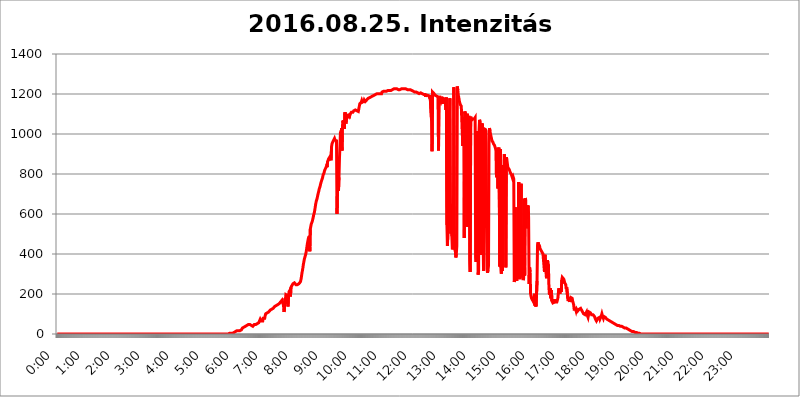
| Category | 2016.08.25. Intenzitás [W/m^2] |
|---|---|
| 0.0 | 0 |
| 0.0006944444444444445 | 0 |
| 0.001388888888888889 | 0 |
| 0.0020833333333333333 | 0 |
| 0.002777777777777778 | 0 |
| 0.003472222222222222 | 0 |
| 0.004166666666666667 | 0 |
| 0.004861111111111111 | 0 |
| 0.005555555555555556 | 0 |
| 0.0062499999999999995 | 0 |
| 0.006944444444444444 | 0 |
| 0.007638888888888889 | 0 |
| 0.008333333333333333 | 0 |
| 0.009027777777777779 | 0 |
| 0.009722222222222222 | 0 |
| 0.010416666666666666 | 0 |
| 0.011111111111111112 | 0 |
| 0.011805555555555555 | 0 |
| 0.012499999999999999 | 0 |
| 0.013194444444444444 | 0 |
| 0.013888888888888888 | 0 |
| 0.014583333333333332 | 0 |
| 0.015277777777777777 | 0 |
| 0.015972222222222224 | 0 |
| 0.016666666666666666 | 0 |
| 0.017361111111111112 | 0 |
| 0.018055555555555557 | 0 |
| 0.01875 | 0 |
| 0.019444444444444445 | 0 |
| 0.02013888888888889 | 0 |
| 0.020833333333333332 | 0 |
| 0.02152777777777778 | 0 |
| 0.022222222222222223 | 0 |
| 0.02291666666666667 | 0 |
| 0.02361111111111111 | 0 |
| 0.024305555555555556 | 0 |
| 0.024999999999999998 | 0 |
| 0.025694444444444447 | 0 |
| 0.02638888888888889 | 0 |
| 0.027083333333333334 | 0 |
| 0.027777777777777776 | 0 |
| 0.02847222222222222 | 0 |
| 0.029166666666666664 | 0 |
| 0.029861111111111113 | 0 |
| 0.030555555555555555 | 0 |
| 0.03125 | 0 |
| 0.03194444444444445 | 0 |
| 0.03263888888888889 | 0 |
| 0.03333333333333333 | 0 |
| 0.034027777777777775 | 0 |
| 0.034722222222222224 | 0 |
| 0.035416666666666666 | 0 |
| 0.036111111111111115 | 0 |
| 0.03680555555555556 | 0 |
| 0.0375 | 0 |
| 0.03819444444444444 | 0 |
| 0.03888888888888889 | 0 |
| 0.03958333333333333 | 0 |
| 0.04027777777777778 | 0 |
| 0.04097222222222222 | 0 |
| 0.041666666666666664 | 0 |
| 0.042361111111111106 | 0 |
| 0.04305555555555556 | 0 |
| 0.043750000000000004 | 0 |
| 0.044444444444444446 | 0 |
| 0.04513888888888889 | 0 |
| 0.04583333333333334 | 0 |
| 0.04652777777777778 | 0 |
| 0.04722222222222222 | 0 |
| 0.04791666666666666 | 0 |
| 0.04861111111111111 | 0 |
| 0.049305555555555554 | 0 |
| 0.049999999999999996 | 0 |
| 0.05069444444444445 | 0 |
| 0.051388888888888894 | 0 |
| 0.052083333333333336 | 0 |
| 0.05277777777777778 | 0 |
| 0.05347222222222222 | 0 |
| 0.05416666666666667 | 0 |
| 0.05486111111111111 | 0 |
| 0.05555555555555555 | 0 |
| 0.05625 | 0 |
| 0.05694444444444444 | 0 |
| 0.057638888888888885 | 0 |
| 0.05833333333333333 | 0 |
| 0.05902777777777778 | 0 |
| 0.059722222222222225 | 0 |
| 0.06041666666666667 | 0 |
| 0.061111111111111116 | 0 |
| 0.06180555555555556 | 0 |
| 0.0625 | 0 |
| 0.06319444444444444 | 0 |
| 0.06388888888888888 | 0 |
| 0.06458333333333334 | 0 |
| 0.06527777777777778 | 0 |
| 0.06597222222222222 | 0 |
| 0.06666666666666667 | 0 |
| 0.06736111111111111 | 0 |
| 0.06805555555555555 | 0 |
| 0.06874999999999999 | 0 |
| 0.06944444444444443 | 0 |
| 0.07013888888888889 | 0 |
| 0.07083333333333333 | 0 |
| 0.07152777777777779 | 0 |
| 0.07222222222222223 | 0 |
| 0.07291666666666667 | 0 |
| 0.07361111111111111 | 0 |
| 0.07430555555555556 | 0 |
| 0.075 | 0 |
| 0.07569444444444444 | 0 |
| 0.0763888888888889 | 0 |
| 0.07708333333333334 | 0 |
| 0.07777777777777778 | 0 |
| 0.07847222222222222 | 0 |
| 0.07916666666666666 | 0 |
| 0.0798611111111111 | 0 |
| 0.08055555555555556 | 0 |
| 0.08125 | 0 |
| 0.08194444444444444 | 0 |
| 0.08263888888888889 | 0 |
| 0.08333333333333333 | 0 |
| 0.08402777777777777 | 0 |
| 0.08472222222222221 | 0 |
| 0.08541666666666665 | 0 |
| 0.08611111111111112 | 0 |
| 0.08680555555555557 | 0 |
| 0.08750000000000001 | 0 |
| 0.08819444444444445 | 0 |
| 0.08888888888888889 | 0 |
| 0.08958333333333333 | 0 |
| 0.09027777777777778 | 0 |
| 0.09097222222222222 | 0 |
| 0.09166666666666667 | 0 |
| 0.09236111111111112 | 0 |
| 0.09305555555555556 | 0 |
| 0.09375 | 0 |
| 0.09444444444444444 | 0 |
| 0.09513888888888888 | 0 |
| 0.09583333333333333 | 0 |
| 0.09652777777777777 | 0 |
| 0.09722222222222222 | 0 |
| 0.09791666666666667 | 0 |
| 0.09861111111111111 | 0 |
| 0.09930555555555555 | 0 |
| 0.09999999999999999 | 0 |
| 0.10069444444444443 | 0 |
| 0.1013888888888889 | 0 |
| 0.10208333333333335 | 0 |
| 0.10277777777777779 | 0 |
| 0.10347222222222223 | 0 |
| 0.10416666666666667 | 0 |
| 0.10486111111111111 | 0 |
| 0.10555555555555556 | 0 |
| 0.10625 | 0 |
| 0.10694444444444444 | 0 |
| 0.1076388888888889 | 0 |
| 0.10833333333333334 | 0 |
| 0.10902777777777778 | 0 |
| 0.10972222222222222 | 0 |
| 0.1111111111111111 | 0 |
| 0.11180555555555556 | 0 |
| 0.11180555555555556 | 0 |
| 0.1125 | 0 |
| 0.11319444444444444 | 0 |
| 0.11388888888888889 | 0 |
| 0.11458333333333333 | 0 |
| 0.11527777777777777 | 0 |
| 0.11597222222222221 | 0 |
| 0.11666666666666665 | 0 |
| 0.1173611111111111 | 0 |
| 0.11805555555555557 | 0 |
| 0.11944444444444445 | 0 |
| 0.12013888888888889 | 0 |
| 0.12083333333333333 | 0 |
| 0.12152777777777778 | 0 |
| 0.12222222222222223 | 0 |
| 0.12291666666666667 | 0 |
| 0.12291666666666667 | 0 |
| 0.12361111111111112 | 0 |
| 0.12430555555555556 | 0 |
| 0.125 | 0 |
| 0.12569444444444444 | 0 |
| 0.12638888888888888 | 0 |
| 0.12708333333333333 | 0 |
| 0.16875 | 0 |
| 0.12847222222222224 | 0 |
| 0.12916666666666668 | 0 |
| 0.12986111111111112 | 0 |
| 0.13055555555555556 | 0 |
| 0.13125 | 0 |
| 0.13194444444444445 | 0 |
| 0.1326388888888889 | 0 |
| 0.13333333333333333 | 0 |
| 0.13402777777777777 | 0 |
| 0.13402777777777777 | 0 |
| 0.13472222222222222 | 0 |
| 0.13541666666666666 | 0 |
| 0.1361111111111111 | 0 |
| 0.13749999999999998 | 0 |
| 0.13819444444444443 | 0 |
| 0.1388888888888889 | 0 |
| 0.13958333333333334 | 0 |
| 0.14027777777777778 | 0 |
| 0.14097222222222222 | 0 |
| 0.14166666666666666 | 0 |
| 0.1423611111111111 | 0 |
| 0.14305555555555557 | 0 |
| 0.14375000000000002 | 0 |
| 0.14444444444444446 | 0 |
| 0.1451388888888889 | 0 |
| 0.1451388888888889 | 0 |
| 0.14652777777777778 | 0 |
| 0.14722222222222223 | 0 |
| 0.14791666666666667 | 0 |
| 0.1486111111111111 | 0 |
| 0.14930555555555555 | 0 |
| 0.15 | 0 |
| 0.15069444444444444 | 0 |
| 0.15138888888888888 | 0 |
| 0.15208333333333332 | 0 |
| 0.15277777777777776 | 0 |
| 0.15347222222222223 | 0 |
| 0.15416666666666667 | 0 |
| 0.15486111111111112 | 0 |
| 0.15555555555555556 | 0 |
| 0.15625 | 0 |
| 0.15694444444444444 | 0 |
| 0.15763888888888888 | 0 |
| 0.15833333333333333 | 0 |
| 0.15902777777777777 | 0 |
| 0.15972222222222224 | 0 |
| 0.16041666666666668 | 0 |
| 0.16111111111111112 | 0 |
| 0.16180555555555556 | 0 |
| 0.1625 | 0 |
| 0.16319444444444445 | 0 |
| 0.1638888888888889 | 0 |
| 0.16458333333333333 | 0 |
| 0.16527777777777777 | 0 |
| 0.16597222222222222 | 0 |
| 0.16666666666666666 | 0 |
| 0.1673611111111111 | 0 |
| 0.16805555555555554 | 0 |
| 0.16874999999999998 | 0 |
| 0.16944444444444443 | 0 |
| 0.17013888888888887 | 0 |
| 0.1708333333333333 | 0 |
| 0.17152777777777775 | 0 |
| 0.17222222222222225 | 0 |
| 0.1729166666666667 | 0 |
| 0.17361111111111113 | 0 |
| 0.17430555555555557 | 0 |
| 0.17500000000000002 | 0 |
| 0.17569444444444446 | 0 |
| 0.1763888888888889 | 0 |
| 0.17708333333333334 | 0 |
| 0.17777777777777778 | 0 |
| 0.17847222222222223 | 0 |
| 0.17916666666666667 | 0 |
| 0.1798611111111111 | 0 |
| 0.18055555555555555 | 0 |
| 0.18125 | 0 |
| 0.18194444444444444 | 0 |
| 0.1826388888888889 | 0 |
| 0.18333333333333335 | 0 |
| 0.1840277777777778 | 0 |
| 0.18472222222222223 | 0 |
| 0.18541666666666667 | 0 |
| 0.18611111111111112 | 0 |
| 0.18680555555555556 | 0 |
| 0.1875 | 0 |
| 0.18819444444444444 | 0 |
| 0.18888888888888888 | 0 |
| 0.18958333333333333 | 0 |
| 0.19027777777777777 | 0 |
| 0.1909722222222222 | 0 |
| 0.19166666666666665 | 0 |
| 0.19236111111111112 | 0 |
| 0.19305555555555554 | 0 |
| 0.19375 | 0 |
| 0.19444444444444445 | 0 |
| 0.1951388888888889 | 0 |
| 0.19583333333333333 | 0 |
| 0.19652777777777777 | 0 |
| 0.19722222222222222 | 0 |
| 0.19791666666666666 | 0 |
| 0.1986111111111111 | 0 |
| 0.19930555555555554 | 0 |
| 0.19999999999999998 | 0 |
| 0.20069444444444443 | 0 |
| 0.20138888888888887 | 0 |
| 0.2020833333333333 | 0 |
| 0.2027777777777778 | 0 |
| 0.2034722222222222 | 0 |
| 0.2041666666666667 | 0 |
| 0.20486111111111113 | 0 |
| 0.20555555555555557 | 0 |
| 0.20625000000000002 | 0 |
| 0.20694444444444446 | 0 |
| 0.2076388888888889 | 0 |
| 0.20833333333333334 | 0 |
| 0.20902777777777778 | 0 |
| 0.20972222222222223 | 0 |
| 0.21041666666666667 | 0 |
| 0.2111111111111111 | 0 |
| 0.21180555555555555 | 0 |
| 0.2125 | 0 |
| 0.21319444444444444 | 0 |
| 0.2138888888888889 | 0 |
| 0.21458333333333335 | 0 |
| 0.2152777777777778 | 0 |
| 0.21597222222222223 | 0 |
| 0.21666666666666667 | 0 |
| 0.21736111111111112 | 0 |
| 0.21805555555555556 | 0 |
| 0.21875 | 0 |
| 0.21944444444444444 | 0 |
| 0.22013888888888888 | 0 |
| 0.22083333333333333 | 0 |
| 0.22152777777777777 | 0 |
| 0.2222222222222222 | 0 |
| 0.22291666666666665 | 0 |
| 0.2236111111111111 | 0 |
| 0.22430555555555556 | 0 |
| 0.225 | 0 |
| 0.22569444444444445 | 0 |
| 0.2263888888888889 | 0 |
| 0.22708333333333333 | 0 |
| 0.22777777777777777 | 0 |
| 0.22847222222222222 | 0 |
| 0.22916666666666666 | 0 |
| 0.2298611111111111 | 0 |
| 0.23055555555555554 | 0 |
| 0.23124999999999998 | 0 |
| 0.23194444444444443 | 0 |
| 0.23263888888888887 | 0 |
| 0.2333333333333333 | 0 |
| 0.2340277777777778 | 0 |
| 0.2347222222222222 | 0 |
| 0.2354166666666667 | 0 |
| 0.23611111111111113 | 0 |
| 0.23680555555555557 | 0 |
| 0.23750000000000002 | 0 |
| 0.23819444444444446 | 0 |
| 0.2388888888888889 | 0 |
| 0.23958333333333334 | 0 |
| 0.24027777777777778 | 0 |
| 0.24097222222222223 | 3.525 |
| 0.24166666666666667 | 3.525 |
| 0.2423611111111111 | 3.525 |
| 0.24305555555555555 | 3.525 |
| 0.24375 | 3.525 |
| 0.24444444444444446 | 3.525 |
| 0.24513888888888888 | 3.525 |
| 0.24583333333333335 | 3.525 |
| 0.2465277777777778 | 7.887 |
| 0.24722222222222223 | 7.887 |
| 0.24791666666666667 | 7.887 |
| 0.24861111111111112 | 7.887 |
| 0.24930555555555556 | 12.257 |
| 0.25 | 12.257 |
| 0.25069444444444444 | 12.257 |
| 0.2513888888888889 | 12.257 |
| 0.2520833333333333 | 16.636 |
| 0.25277777777777777 | 16.636 |
| 0.2534722222222222 | 16.636 |
| 0.25416666666666665 | 16.636 |
| 0.2548611111111111 | 16.636 |
| 0.2555555555555556 | 16.636 |
| 0.25625000000000003 | 16.636 |
| 0.2569444444444445 | 21.024 |
| 0.2576388888888889 | 21.024 |
| 0.25833333333333336 | 21.024 |
| 0.2590277777777778 | 21.024 |
| 0.25972222222222224 | 29.823 |
| 0.2604166666666667 | 29.823 |
| 0.2611111111111111 | 29.823 |
| 0.26180555555555557 | 34.234 |
| 0.2625 | 34.234 |
| 0.26319444444444445 | 38.653 |
| 0.2638888888888889 | 38.653 |
| 0.26458333333333334 | 43.079 |
| 0.2652777777777778 | 43.079 |
| 0.2659722222222222 | 43.079 |
| 0.26666666666666666 | 43.079 |
| 0.2673611111111111 | 47.511 |
| 0.26805555555555555 | 47.511 |
| 0.26875 | 47.511 |
| 0.26944444444444443 | 47.511 |
| 0.2701388888888889 | 47.511 |
| 0.2708333333333333 | 47.511 |
| 0.27152777777777776 | 43.079 |
| 0.2722222222222222 | 43.079 |
| 0.27291666666666664 | 38.653 |
| 0.2736111111111111 | 38.653 |
| 0.2743055555555555 | 38.653 |
| 0.27499999999999997 | 43.079 |
| 0.27569444444444446 | 43.079 |
| 0.27638888888888885 | 47.511 |
| 0.27708333333333335 | 47.511 |
| 0.2777777777777778 | 47.511 |
| 0.27847222222222223 | 47.511 |
| 0.2791666666666667 | 47.511 |
| 0.2798611111111111 | 47.511 |
| 0.28055555555555556 | 51.951 |
| 0.28125 | 51.951 |
| 0.28194444444444444 | 56.398 |
| 0.2826388888888889 | 56.398 |
| 0.2833333333333333 | 60.85 |
| 0.28402777777777777 | 56.398 |
| 0.2847222222222222 | 74.246 |
| 0.28541666666666665 | 74.246 |
| 0.28611111111111115 | 65.31 |
| 0.28680555555555554 | 60.85 |
| 0.28750000000000003 | 60.85 |
| 0.2881944444444445 | 65.31 |
| 0.2888888888888889 | 78.722 |
| 0.28958333333333336 | 83.205 |
| 0.2902777777777778 | 83.205 |
| 0.29097222222222224 | 78.722 |
| 0.2916666666666667 | 92.184 |
| 0.2923611111111111 | 101.184 |
| 0.29305555555555557 | 101.184 |
| 0.29375 | 105.69 |
| 0.29444444444444445 | 105.69 |
| 0.2951388888888889 | 110.201 |
| 0.29583333333333334 | 110.201 |
| 0.2965277777777778 | 110.201 |
| 0.2972222222222222 | 114.716 |
| 0.29791666666666666 | 114.716 |
| 0.2986111111111111 | 119.235 |
| 0.29930555555555555 | 119.235 |
| 0.3 | 119.235 |
| 0.30069444444444443 | 123.758 |
| 0.3013888888888889 | 123.758 |
| 0.3020833333333333 | 128.284 |
| 0.30277777777777776 | 128.284 |
| 0.3034722222222222 | 132.814 |
| 0.30416666666666664 | 132.814 |
| 0.3048611111111111 | 137.347 |
| 0.3055555555555555 | 137.347 |
| 0.30624999999999997 | 137.347 |
| 0.3069444444444444 | 141.884 |
| 0.3076388888888889 | 141.884 |
| 0.30833333333333335 | 146.423 |
| 0.3090277777777778 | 146.423 |
| 0.30972222222222223 | 150.964 |
| 0.3104166666666667 | 146.423 |
| 0.3111111111111111 | 150.964 |
| 0.31180555555555556 | 150.964 |
| 0.3125 | 155.509 |
| 0.31319444444444444 | 160.056 |
| 0.3138888888888889 | 160.056 |
| 0.3145833333333333 | 160.056 |
| 0.31527777777777777 | 169.156 |
| 0.3159722222222222 | 164.605 |
| 0.31666666666666665 | 173.709 |
| 0.31736111111111115 | 141.884 |
| 0.31805555555555554 | 110.201 |
| 0.31875000000000003 | 128.284 |
| 0.3194444444444445 | 178.264 |
| 0.3201388888888889 | 150.964 |
| 0.32083333333333336 | 196.497 |
| 0.3215277777777778 | 196.497 |
| 0.32222222222222224 | 191.937 |
| 0.3229166666666667 | 191.937 |
| 0.3236111111111111 | 137.347 |
| 0.32430555555555557 | 182.82 |
| 0.325 | 210.182 |
| 0.32569444444444445 | 210.182 |
| 0.3263888888888889 | 219.309 |
| 0.32708333333333334 | 187.378 |
| 0.3277777777777778 | 233 |
| 0.3284722222222222 | 233 |
| 0.32916666666666666 | 242.127 |
| 0.3298611111111111 | 246.689 |
| 0.33055555555555555 | 251.251 |
| 0.33125 | 255.813 |
| 0.33194444444444443 | 255.813 |
| 0.3326388888888889 | 255.813 |
| 0.3333333333333333 | 255.813 |
| 0.3340277777777778 | 251.251 |
| 0.3347222222222222 | 246.689 |
| 0.3354166666666667 | 246.689 |
| 0.3361111111111111 | 246.689 |
| 0.3368055555555556 | 246.689 |
| 0.33749999999999997 | 246.689 |
| 0.33819444444444446 | 251.251 |
| 0.33888888888888885 | 251.251 |
| 0.33958333333333335 | 251.251 |
| 0.34027777777777773 | 255.813 |
| 0.34097222222222223 | 260.373 |
| 0.3416666666666666 | 269.49 |
| 0.3423611111111111 | 283.156 |
| 0.3430555555555555 | 301.354 |
| 0.34375 | 314.98 |
| 0.3444444444444445 | 328.584 |
| 0.3451388888888889 | 346.682 |
| 0.3458333333333334 | 360.221 |
| 0.34652777777777777 | 373.729 |
| 0.34722222222222227 | 382.715 |
| 0.34791666666666665 | 378.224 |
| 0.34861111111111115 | 400.638 |
| 0.34930555555555554 | 414.035 |
| 0.35000000000000003 | 431.833 |
| 0.3506944444444444 | 449.551 |
| 0.3513888888888889 | 462.786 |
| 0.3520833333333333 | 475.972 |
| 0.3527777777777778 | 480.356 |
| 0.3534722222222222 | 489.108 |
| 0.3541666666666667 | 414.035 |
| 0.3548611111111111 | 523.88 |
| 0.35555555555555557 | 536.82 |
| 0.35625 | 549.704 |
| 0.35694444444444445 | 553.986 |
| 0.3576388888888889 | 562.53 |
| 0.35833333333333334 | 566.793 |
| 0.3590277777777778 | 583.779 |
| 0.3597222222222222 | 596.45 |
| 0.36041666666666666 | 604.864 |
| 0.3611111111111111 | 617.436 |
| 0.36180555555555555 | 634.105 |
| 0.3625 | 650.667 |
| 0.36319444444444443 | 663.019 |
| 0.3638888888888889 | 667.123 |
| 0.3645833333333333 | 679.395 |
| 0.3652777777777778 | 691.608 |
| 0.3659722222222222 | 703.762 |
| 0.3666666666666667 | 711.832 |
| 0.3673611111111111 | 723.889 |
| 0.3680555555555556 | 731.896 |
| 0.36874999999999997 | 739.877 |
| 0.36944444444444446 | 751.803 |
| 0.37013888888888885 | 755.766 |
| 0.37083333333333335 | 767.62 |
| 0.37152777777777773 | 775.492 |
| 0.37222222222222223 | 783.342 |
| 0.3729166666666666 | 795.074 |
| 0.3736111111111111 | 798.974 |
| 0.3743055555555555 | 806.757 |
| 0.375 | 818.392 |
| 0.3756944444444445 | 818.392 |
| 0.3763888888888889 | 822.26 |
| 0.3770833333333334 | 833.834 |
| 0.37777777777777777 | 841.526 |
| 0.37847222222222227 | 833.834 |
| 0.37916666666666665 | 860.676 |
| 0.37986111111111115 | 868.305 |
| 0.38055555555555554 | 875.918 |
| 0.38125000000000003 | 879.719 |
| 0.3819444444444444 | 883.516 |
| 0.3826388888888889 | 887.309 |
| 0.3833333333333333 | 883.516 |
| 0.3840277777777778 | 868.305 |
| 0.3847222222222222 | 936.33 |
| 0.3854166666666667 | 951.327 |
| 0.3861111111111111 | 955.071 |
| 0.38680555555555557 | 962.555 |
| 0.3875 | 962.555 |
| 0.38819444444444445 | 962.555 |
| 0.3888888888888889 | 977.508 |
| 0.38958333333333334 | 970.034 |
| 0.3902777777777778 | 970.034 |
| 0.3909722222222222 | 970.034 |
| 0.39166666666666666 | 966.295 |
| 0.3923611111111111 | 600.661 |
| 0.39305555555555555 | 715.858 |
| 0.39375 | 763.674 |
| 0.39444444444444443 | 715.858 |
| 0.3951388888888889 | 783.342 |
| 0.3958333333333333 | 879.719 |
| 0.3965277777777778 | 940.082 |
| 0.3972222222222222 | 1011.118 |
| 0.3979166666666667 | 966.295 |
| 0.3986111111111111 | 1029.798 |
| 0.3993055555555556 | 917.534 |
| 0.39999999999999997 | 1037.277 |
| 0.40069444444444446 | 1067.267 |
| 0.40138888888888885 | 1052.255 |
| 0.40208333333333335 | 1067.267 |
| 0.40277777777777773 | 1026.06 |
| 0.40347222222222223 | 1108.816 |
| 0.4041666666666666 | 1093.653 |
| 0.4048611111111111 | 1052.255 |
| 0.4055555555555555 | 1071.027 |
| 0.40625 | 1093.653 |
| 0.4069444444444445 | 1089.873 |
| 0.4076388888888889 | 1089.873 |
| 0.4083333333333334 | 1093.653 |
| 0.40902777777777777 | 1078.555 |
| 0.40972222222222227 | 1101.226 |
| 0.41041666666666665 | 1093.653 |
| 0.41111111111111115 | 1101.226 |
| 0.41180555555555554 | 1105.019 |
| 0.41250000000000003 | 1108.816 |
| 0.4131944444444444 | 1108.816 |
| 0.4138888888888889 | 1108.816 |
| 0.4145833333333333 | 1108.816 |
| 0.4152777777777778 | 1112.618 |
| 0.4159722222222222 | 1116.426 |
| 0.4166666666666667 | 1116.426 |
| 0.4173611111111111 | 1120.238 |
| 0.41805555555555557 | 1120.238 |
| 0.41875 | 1116.426 |
| 0.41944444444444445 | 1116.426 |
| 0.4201388888888889 | 1116.426 |
| 0.42083333333333334 | 1112.618 |
| 0.4215277777777778 | 1112.618 |
| 0.4222222222222222 | 1112.618 |
| 0.42291666666666666 | 1116.426 |
| 0.4236111111111111 | 1116.426 |
| 0.42430555555555555 | 1150.946 |
| 0.425 | 1147.086 |
| 0.42569444444444443 | 1147.086 |
| 0.4263888888888889 | 1158.689 |
| 0.4270833333333333 | 1166.46 |
| 0.4277777777777778 | 1158.689 |
| 0.4284722222222222 | 1158.689 |
| 0.4291666666666667 | 1158.689 |
| 0.4298611111111111 | 1162.571 |
| 0.4305555555555556 | 1170.358 |
| 0.43124999999999997 | 1166.46 |
| 0.43194444444444446 | 1162.571 |
| 0.43263888888888885 | 1166.46 |
| 0.43333333333333335 | 1162.571 |
| 0.43402777777777773 | 1170.358 |
| 0.43472222222222223 | 1170.358 |
| 0.4354166666666666 | 1174.263 |
| 0.4361111111111111 | 1178.177 |
| 0.4368055555555555 | 1178.177 |
| 0.4375 | 1178.177 |
| 0.4381944444444445 | 1182.099 |
| 0.4388888888888889 | 1178.177 |
| 0.4395833333333334 | 1182.099 |
| 0.44027777777777777 | 1186.03 |
| 0.44097222222222227 | 1186.03 |
| 0.44166666666666665 | 1186.03 |
| 0.44236111111111115 | 1189.969 |
| 0.44305555555555554 | 1193.918 |
| 0.44375000000000003 | 1193.918 |
| 0.4444444444444444 | 1193.918 |
| 0.4451388888888889 | 1193.918 |
| 0.4458333333333333 | 1197.876 |
| 0.4465277777777778 | 1197.876 |
| 0.4472222222222222 | 1197.876 |
| 0.4479166666666667 | 1201.843 |
| 0.4486111111111111 | 1201.843 |
| 0.44930555555555557 | 1201.843 |
| 0.45 | 1201.843 |
| 0.45069444444444445 | 1201.843 |
| 0.4513888888888889 | 1201.843 |
| 0.45208333333333334 | 1201.843 |
| 0.4527777777777778 | 1201.843 |
| 0.4534722222222222 | 1197.876 |
| 0.45416666666666666 | 1201.843 |
| 0.4548611111111111 | 1201.843 |
| 0.45555555555555555 | 1209.807 |
| 0.45625 | 1213.804 |
| 0.45694444444444443 | 1213.804 |
| 0.4576388888888889 | 1213.804 |
| 0.4583333333333333 | 1209.807 |
| 0.4590277777777778 | 1213.804 |
| 0.4597222222222222 | 1213.804 |
| 0.4604166666666667 | 1213.804 |
| 0.4611111111111111 | 1217.812 |
| 0.4618055555555556 | 1213.804 |
| 0.46249999999999997 | 1213.804 |
| 0.46319444444444446 | 1213.804 |
| 0.46388888888888885 | 1217.812 |
| 0.46458333333333335 | 1217.812 |
| 0.46527777777777773 | 1213.804 |
| 0.46597222222222223 | 1217.812 |
| 0.4666666666666666 | 1217.812 |
| 0.4673611111111111 | 1213.804 |
| 0.4680555555555555 | 1217.812 |
| 0.46875 | 1217.812 |
| 0.4694444444444445 | 1221.83 |
| 0.4701388888888889 | 1221.83 |
| 0.4708333333333334 | 1221.83 |
| 0.47152777777777777 | 1225.859 |
| 0.47222222222222227 | 1225.859 |
| 0.47291666666666665 | 1225.859 |
| 0.47361111111111115 | 1225.859 |
| 0.47430555555555554 | 1225.859 |
| 0.47500000000000003 | 1225.859 |
| 0.4756944444444444 | 1225.859 |
| 0.4763888888888889 | 1225.859 |
| 0.4770833333333333 | 1225.859 |
| 0.4777777777777778 | 1221.83 |
| 0.4784722222222222 | 1221.83 |
| 0.4791666666666667 | 1221.83 |
| 0.4798611111111111 | 1221.83 |
| 0.48055555555555557 | 1221.83 |
| 0.48125 | 1225.859 |
| 0.48194444444444445 | 1225.859 |
| 0.4826388888888889 | 1225.859 |
| 0.48333333333333334 | 1225.859 |
| 0.4840277777777778 | 1225.859 |
| 0.4847222222222222 | 1225.859 |
| 0.48541666666666666 | 1225.859 |
| 0.4861111111111111 | 1225.859 |
| 0.48680555555555555 | 1225.859 |
| 0.4875 | 1225.859 |
| 0.48819444444444443 | 1225.859 |
| 0.4888888888888889 | 1225.859 |
| 0.4895833333333333 | 1221.83 |
| 0.4902777777777778 | 1225.859 |
| 0.4909722222222222 | 1221.83 |
| 0.4916666666666667 | 1221.83 |
| 0.4923611111111111 | 1221.83 |
| 0.4930555555555556 | 1221.83 |
| 0.49374999999999997 | 1221.83 |
| 0.49444444444444446 | 1225.859 |
| 0.49513888888888885 | 1221.83 |
| 0.49583333333333335 | 1217.812 |
| 0.49652777777777773 | 1217.812 |
| 0.49722222222222223 | 1217.812 |
| 0.4979166666666666 | 1217.812 |
| 0.4986111111111111 | 1217.812 |
| 0.4993055555555555 | 1213.804 |
| 0.5 | 1213.804 |
| 0.5006944444444444 | 1209.807 |
| 0.5013888888888889 | 1209.807 |
| 0.5020833333333333 | 1209.807 |
| 0.5027777777777778 | 1209.807 |
| 0.5034722222222222 | 1209.807 |
| 0.5041666666666667 | 1205.82 |
| 0.5048611111111111 | 1205.82 |
| 0.5055555555555555 | 1205.82 |
| 0.50625 | 1205.82 |
| 0.5069444444444444 | 1205.82 |
| 0.5076388888888889 | 1201.843 |
| 0.5083333333333333 | 1205.82 |
| 0.5090277777777777 | 1201.843 |
| 0.5097222222222222 | 1205.82 |
| 0.5104166666666666 | 1201.843 |
| 0.5111111111111112 | 1201.843 |
| 0.5118055555555555 | 1201.843 |
| 0.5125000000000001 | 1201.843 |
| 0.5131944444444444 | 1197.876 |
| 0.513888888888889 | 1197.876 |
| 0.5145833333333333 | 1193.918 |
| 0.5152777777777778 | 1197.876 |
| 0.5159722222222222 | 1197.876 |
| 0.5166666666666667 | 1186.03 |
| 0.517361111111111 | 1193.918 |
| 0.5180555555555556 | 1189.969 |
| 0.5187499999999999 | 1193.918 |
| 0.5194444444444445 | 1193.918 |
| 0.5201388888888888 | 1189.969 |
| 0.5208333333333334 | 1189.969 |
| 0.5215277777777778 | 1189.969 |
| 0.5222222222222223 | 1178.177 |
| 0.5229166666666667 | 1193.918 |
| 0.5236111111111111 | 1197.876 |
| 0.5243055555555556 | 1197.876 |
| 0.525 | 1067.267 |
| 0.5256944444444445 | 913.766 |
| 0.5263888888888889 | 1209.807 |
| 0.5270833333333333 | 1205.82 |
| 0.5277777777777778 | 1205.82 |
| 0.5284722222222222 | 1201.843 |
| 0.5291666666666667 | 1197.876 |
| 0.5298611111111111 | 1193.918 |
| 0.5305555555555556 | 1189.969 |
| 0.53125 | 1189.969 |
| 0.5319444444444444 | 1189.969 |
| 0.5326388888888889 | 1186.03 |
| 0.5333333333333333 | 1186.03 |
| 0.5340277777777778 | 1186.03 |
| 0.5347222222222222 | 917.534 |
| 0.5354166666666667 | 1189.969 |
| 0.5361111111111111 | 1189.969 |
| 0.5368055555555555 | 1178.177 |
| 0.5375 | 1170.358 |
| 0.5381944444444444 | 1162.571 |
| 0.5388888888888889 | 1170.358 |
| 0.5395833333333333 | 1170.358 |
| 0.5402777777777777 | 1166.46 |
| 0.5409722222222222 | 1150.946 |
| 0.5416666666666666 | 1178.177 |
| 0.5423611111111112 | 1178.177 |
| 0.5430555555555555 | 1182.099 |
| 0.5437500000000001 | 1174.263 |
| 0.5444444444444444 | 1174.263 |
| 0.545138888888889 | 1120.238 |
| 0.5458333333333333 | 1182.099 |
| 0.5465277777777778 | 545.416 |
| 0.5472222222222222 | 440.702 |
| 0.5479166666666667 | 510.885 |
| 0.548611111111111 | 739.877 |
| 0.5493055555555556 | 936.33 |
| 0.5499999999999999 | 1093.653 |
| 0.5506944444444445 | 1178.177 |
| 0.5513888888888888 | 558.261 |
| 0.5520833333333334 | 502.192 |
| 0.5527777777777778 | 650.667 |
| 0.5534722222222223 | 489.108 |
| 0.5541666666666667 | 422.943 |
| 0.5548611111111111 | 418.492 |
| 0.5555555555555556 | 445.129 |
| 0.55625 | 1233.951 |
| 0.5569444444444445 | 445.129 |
| 0.5576388888888889 | 497.836 |
| 0.5583333333333333 | 414.035 |
| 0.5590277777777778 | 382.715 |
| 0.5597222222222222 | 400.638 |
| 0.5604166666666667 | 440.702 |
| 0.5611111111111111 | 1238.014 |
| 0.5618055555555556 | 1217.812 |
| 0.5625 | 1193.918 |
| 0.5631944444444444 | 1182.099 |
| 0.5638888888888889 | 1166.46 |
| 0.5645833333333333 | 1154.814 |
| 0.5652777777777778 | 1147.086 |
| 0.5659722222222222 | 1147.086 |
| 0.5666666666666667 | 1139.384 |
| 0.5673611111111111 | 1143.232 |
| 0.5680555555555555 | 1139.384 |
| 0.56875 | 940.082 |
| 0.5694444444444444 | 1082.324 |
| 0.5701388888888889 | 1071.027 |
| 0.5708333333333333 | 480.356 |
| 0.5715277777777777 | 1112.618 |
| 0.5722222222222222 | 1108.816 |
| 0.5729166666666666 | 1097.437 |
| 0.5736111111111112 | 1101.226 |
| 0.5743055555555555 | 1037.277 |
| 0.5750000000000001 | 1101.226 |
| 0.5756944444444444 | 536.82 |
| 0.576388888888889 | 1014.852 |
| 0.5770833333333333 | 1089.873 |
| 0.5777777777777778 | 1082.324 |
| 0.5784722222222222 | 364.728 |
| 0.5791666666666667 | 310.44 |
| 0.579861111111111 | 1086.097 |
| 0.5805555555555556 | 1067.267 |
| 0.5812499999999999 | 1071.027 |
| 0.5819444444444445 | 1071.027 |
| 0.5826388888888888 | 1074.789 |
| 0.5833333333333334 | 1071.027 |
| 0.5840277777777778 | 1074.789 |
| 0.5847222222222223 | 1074.789 |
| 0.5854166666666667 | 1071.027 |
| 0.5861111111111111 | 1082.324 |
| 0.5868055555555556 | 382.715 |
| 0.5875 | 360.221 |
| 0.5881944444444445 | 575.299 |
| 0.5888888888888889 | 1014.852 |
| 0.5895833333333333 | 909.996 |
| 0.5902777777777778 | 296.808 |
| 0.5909722222222222 | 314.98 |
| 0.5916666666666667 | 1022.323 |
| 0.5923611111111111 | 1071.027 |
| 0.5930555555555556 | 1059.756 |
| 0.59375 | 1044.762 |
| 0.5944444444444444 | 1052.255 |
| 0.5951388888888889 | 396.164 |
| 0.5958333333333333 | 1052.255 |
| 0.5965277777777778 | 1033.537 |
| 0.5972222222222222 | 467.187 |
| 0.5979166666666667 | 314.98 |
| 0.5986111111111111 | 1026.06 |
| 0.5993055555555555 | 1022.323 |
| 0.6 | 1026.06 |
| 0.6006944444444444 | 1022.323 |
| 0.6013888888888889 | 1014.852 |
| 0.6020833333333333 | 1014.852 |
| 0.6027777777777777 | 324.052 |
| 0.6034722222222222 | 305.898 |
| 0.6041666666666666 | 319.517 |
| 0.6048611111111112 | 342.162 |
| 0.6055555555555555 | 951.327 |
| 0.6062500000000001 | 1029.798 |
| 0.6069444444444444 | 1014.852 |
| 0.607638888888889 | 999.916 |
| 0.6083333333333333 | 988.714 |
| 0.6090277777777778 | 977.508 |
| 0.6097222222222222 | 966.295 |
| 0.6104166666666667 | 966.295 |
| 0.611111111111111 | 958.814 |
| 0.6118055555555556 | 951.327 |
| 0.6124999999999999 | 947.58 |
| 0.6131944444444445 | 943.832 |
| 0.6138888888888888 | 940.082 |
| 0.6145833333333334 | 928.819 |
| 0.6152777777777778 | 917.534 |
| 0.6159722222222223 | 783.342 |
| 0.6166666666666667 | 902.447 |
| 0.6173611111111111 | 837.682 |
| 0.6180555555555556 | 727.896 |
| 0.61875 | 925.06 |
| 0.6194444444444445 | 932.576 |
| 0.6201388888888889 | 928.819 |
| 0.6208333333333333 | 337.639 |
| 0.6215277777777778 | 925.06 |
| 0.6222222222222222 | 333.113 |
| 0.6229166666666667 | 301.354 |
| 0.6236111111111111 | 663.019 |
| 0.6243055555555556 | 314.98 |
| 0.625 | 319.517 |
| 0.6256944444444444 | 845.365 |
| 0.6263888888888889 | 707.8 |
| 0.6270833333333333 | 898.668 |
| 0.6277777777777778 | 894.885 |
| 0.6284722222222222 | 802.868 |
| 0.6291666666666667 | 333.113 |
| 0.6298611111111111 | 883.516 |
| 0.6305555555555555 | 872.114 |
| 0.63125 | 853.029 |
| 0.6319444444444444 | 833.834 |
| 0.6326388888888889 | 837.682 |
| 0.6333333333333333 | 829.981 |
| 0.6340277777777777 | 822.26 |
| 0.6347222222222222 | 814.519 |
| 0.6354166666666666 | 806.757 |
| 0.6361111111111112 | 802.868 |
| 0.6368055555555555 | 798.974 |
| 0.6375000000000001 | 791.169 |
| 0.6381944444444444 | 787.258 |
| 0.638888888888889 | 775.492 |
| 0.6395833333333333 | 783.342 |
| 0.6402777777777778 | 775.492 |
| 0.6409722222222222 | 260.373 |
| 0.6416666666666667 | 274.047 |
| 0.642361111111111 | 634.105 |
| 0.6430555555555556 | 292.259 |
| 0.6437499999999999 | 292.259 |
| 0.6444444444444445 | 264.932 |
| 0.6451388888888888 | 264.932 |
| 0.6458333333333334 | 480.356 |
| 0.6465277777777778 | 292.259 |
| 0.6472222222222223 | 759.723 |
| 0.6479166666666667 | 296.808 |
| 0.6486111111111111 | 274.047 |
| 0.6493055555555556 | 274.047 |
| 0.65 | 654.791 |
| 0.6506944444444445 | 751.803 |
| 0.6513888888888889 | 283.156 |
| 0.6520833333333333 | 278.603 |
| 0.6527777777777778 | 328.584 |
| 0.6534722222222222 | 269.49 |
| 0.6541666666666667 | 278.603 |
| 0.6548611111111111 | 675.311 |
| 0.6555555555555556 | 292.259 |
| 0.65625 | 679.395 |
| 0.6569444444444444 | 671.22 |
| 0.6576388888888889 | 528.2 |
| 0.6583333333333333 | 625.784 |
| 0.6590277777777778 | 642.4 |
| 0.6597222222222222 | 634.105 |
| 0.6604166666666667 | 642.4 |
| 0.6611111111111111 | 583.779 |
| 0.6618055555555555 | 251.251 |
| 0.6625 | 333.113 |
| 0.6631944444444444 | 310.44 |
| 0.6638888888888889 | 201.058 |
| 0.6645833333333333 | 187.378 |
| 0.6652777777777777 | 178.264 |
| 0.6659722222222222 | 173.709 |
| 0.6666666666666666 | 169.156 |
| 0.6673611111111111 | 164.605 |
| 0.6680555555555556 | 160.056 |
| 0.6687500000000001 | 155.509 |
| 0.6694444444444444 | 201.058 |
| 0.6701388888888888 | 141.884 |
| 0.6708333333333334 | 150.964 |
| 0.6715277777777778 | 137.347 |
| 0.6722222222222222 | 137.347 |
| 0.6729166666666666 | 264.932 |
| 0.6736111111111112 | 445.129 |
| 0.6743055555555556 | 458.38 |
| 0.6749999999999999 | 449.551 |
| 0.6756944444444444 | 449.551 |
| 0.6763888888888889 | 440.702 |
| 0.6770833333333334 | 427.39 |
| 0.6777777777777777 | 422.943 |
| 0.6784722222222223 | 418.492 |
| 0.6791666666666667 | 414.035 |
| 0.6798611111111111 | 409.574 |
| 0.6805555555555555 | 405.108 |
| 0.68125 | 400.638 |
| 0.6819444444444445 | 400.638 |
| 0.6826388888888889 | 396.164 |
| 0.6833333333333332 | 310.44 |
| 0.6840277777777778 | 396.164 |
| 0.6847222222222222 | 351.198 |
| 0.6854166666666667 | 314.98 |
| 0.686111111111111 | 278.603 |
| 0.6868055555555556 | 328.584 |
| 0.6875 | 369.23 |
| 0.6881944444444444 | 355.712 |
| 0.688888888888889 | 346.682 |
| 0.6895833333333333 | 237.564 |
| 0.6902777777777778 | 196.497 |
| 0.6909722222222222 | 191.937 |
| 0.6916666666666668 | 228.436 |
| 0.6923611111111111 | 178.264 |
| 0.6930555555555555 | 219.309 |
| 0.69375 | 164.605 |
| 0.6944444444444445 | 160.056 |
| 0.6951388888888889 | 155.509 |
| 0.6958333333333333 | 150.964 |
| 0.6965277777777777 | 150.964 |
| 0.6972222222222223 | 160.056 |
| 0.6979166666666666 | 173.709 |
| 0.6986111111111111 | 160.056 |
| 0.6993055555555556 | 155.509 |
| 0.7000000000000001 | 155.509 |
| 0.7006944444444444 | 160.056 |
| 0.7013888888888888 | 169.156 |
| 0.7020833333333334 | 178.264 |
| 0.7027777777777778 | 182.82 |
| 0.7034722222222222 | 228.436 |
| 0.7041666666666666 | 223.873 |
| 0.7048611111111112 | 201.058 |
| 0.7055555555555556 | 201.058 |
| 0.7062499999999999 | 228.436 |
| 0.7069444444444444 | 210.182 |
| 0.7076388888888889 | 269.49 |
| 0.7083333333333334 | 283.156 |
| 0.7090277777777777 | 283.156 |
| 0.7097222222222223 | 278.603 |
| 0.7104166666666667 | 274.047 |
| 0.7111111111111111 | 264.932 |
| 0.7118055555555555 | 255.813 |
| 0.7125 | 251.251 |
| 0.7131944444444445 | 246.689 |
| 0.7138888888888889 | 223.873 |
| 0.7145833333333332 | 233 |
| 0.7152777777777778 | 228.436 |
| 0.7159722222222222 | 178.264 |
| 0.7166666666666667 | 164.605 |
| 0.717361111111111 | 169.156 |
| 0.7180555555555556 | 182.82 |
| 0.71875 | 160.056 |
| 0.7194444444444444 | 173.709 |
| 0.720138888888889 | 182.82 |
| 0.7208333333333333 | 182.82 |
| 0.7215277777777778 | 182.82 |
| 0.7222222222222222 | 178.264 |
| 0.7229166666666668 | 164.605 |
| 0.7236111111111111 | 160.056 |
| 0.7243055555555555 | 146.423 |
| 0.725 | 123.758 |
| 0.7256944444444445 | 123.758 |
| 0.7263888888888889 | 123.758 |
| 0.7270833333333333 | 123.758 |
| 0.7277777777777777 | 114.716 |
| 0.7284722222222223 | 123.758 |
| 0.7291666666666666 | 123.758 |
| 0.7298611111111111 | 114.716 |
| 0.7305555555555556 | 119.235 |
| 0.7312500000000001 | 119.235 |
| 0.7319444444444444 | 123.758 |
| 0.7326388888888888 | 123.758 |
| 0.7333333333333334 | 128.284 |
| 0.7340277777777778 | 128.284 |
| 0.7347222222222222 | 123.758 |
| 0.7354166666666666 | 119.235 |
| 0.7361111111111112 | 114.716 |
| 0.7368055555555556 | 110.201 |
| 0.7374999999999999 | 105.69 |
| 0.7381944444444444 | 101.184 |
| 0.7388888888888889 | 101.184 |
| 0.7395833333333334 | 101.184 |
| 0.7402777777777777 | 96.682 |
| 0.7409722222222223 | 96.682 |
| 0.7416666666666667 | 96.682 |
| 0.7423611111111111 | 110.201 |
| 0.7430555555555555 | 96.682 |
| 0.74375 | 92.184 |
| 0.7444444444444445 | 83.205 |
| 0.7451388888888889 | 96.682 |
| 0.7458333333333332 | 110.201 |
| 0.7465277777777778 | 110.201 |
| 0.7472222222222222 | 110.201 |
| 0.7479166666666667 | 105.69 |
| 0.748611111111111 | 101.184 |
| 0.7493055555555556 | 96.682 |
| 0.75 | 92.184 |
| 0.7506944444444444 | 92.184 |
| 0.751388888888889 | 96.682 |
| 0.7520833333333333 | 101.184 |
| 0.7527777777777778 | 92.184 |
| 0.7534722222222222 | 87.692 |
| 0.7541666666666668 | 83.205 |
| 0.7548611111111111 | 74.246 |
| 0.7555555555555555 | 74.246 |
| 0.75625 | 65.31 |
| 0.7569444444444445 | 69.775 |
| 0.7576388888888889 | 69.775 |
| 0.7583333333333333 | 78.722 |
| 0.7590277777777777 | 83.205 |
| 0.7597222222222223 | 83.205 |
| 0.7604166666666666 | 83.205 |
| 0.7611111111111111 | 74.246 |
| 0.7618055555555556 | 74.246 |
| 0.7625000000000001 | 78.722 |
| 0.7631944444444444 | 92.184 |
| 0.7638888888888888 | 101.184 |
| 0.7645833333333334 | 92.184 |
| 0.7652777777777778 | 87.692 |
| 0.7659722222222222 | 78.722 |
| 0.7666666666666666 | 87.692 |
| 0.7673611111111112 | 87.692 |
| 0.7680555555555556 | 87.692 |
| 0.7687499999999999 | 83.205 |
| 0.7694444444444444 | 78.722 |
| 0.7701388888888889 | 78.722 |
| 0.7708333333333334 | 74.246 |
| 0.7715277777777777 | 74.246 |
| 0.7722222222222223 | 74.246 |
| 0.7729166666666667 | 69.775 |
| 0.7736111111111111 | 69.775 |
| 0.7743055555555555 | 65.31 |
| 0.775 | 65.31 |
| 0.7756944444444445 | 60.85 |
| 0.7763888888888889 | 60.85 |
| 0.7770833333333332 | 60.85 |
| 0.7777777777777778 | 56.398 |
| 0.7784722222222222 | 56.398 |
| 0.7791666666666667 | 56.398 |
| 0.779861111111111 | 51.951 |
| 0.7805555555555556 | 51.951 |
| 0.78125 | 51.951 |
| 0.7819444444444444 | 47.511 |
| 0.782638888888889 | 47.511 |
| 0.7833333333333333 | 47.511 |
| 0.7840277777777778 | 47.511 |
| 0.7847222222222222 | 47.511 |
| 0.7854166666666668 | 43.079 |
| 0.7861111111111111 | 43.079 |
| 0.7868055555555555 | 43.079 |
| 0.7875 | 43.079 |
| 0.7881944444444445 | 43.079 |
| 0.7888888888888889 | 38.653 |
| 0.7895833333333333 | 38.653 |
| 0.7902777777777777 | 38.653 |
| 0.7909722222222223 | 38.653 |
| 0.7916666666666666 | 38.653 |
| 0.7923611111111111 | 38.653 |
| 0.7930555555555556 | 34.234 |
| 0.7937500000000001 | 34.234 |
| 0.7944444444444444 | 34.234 |
| 0.7951388888888888 | 34.234 |
| 0.7958333333333334 | 29.823 |
| 0.7965277777777778 | 29.823 |
| 0.7972222222222222 | 29.823 |
| 0.7979166666666666 | 29.823 |
| 0.7986111111111112 | 25.419 |
| 0.7993055555555556 | 25.419 |
| 0.7999999999999999 | 25.419 |
| 0.8006944444444444 | 25.419 |
| 0.8013888888888889 | 21.024 |
| 0.8020833333333334 | 21.024 |
| 0.8027777777777777 | 21.024 |
| 0.8034722222222223 | 16.636 |
| 0.8041666666666667 | 16.636 |
| 0.8048611111111111 | 16.636 |
| 0.8055555555555555 | 16.636 |
| 0.80625 | 12.257 |
| 0.8069444444444445 | 12.257 |
| 0.8076388888888889 | 12.257 |
| 0.8083333333333332 | 12.257 |
| 0.8090277777777778 | 12.257 |
| 0.8097222222222222 | 7.887 |
| 0.8104166666666667 | 7.887 |
| 0.811111111111111 | 7.887 |
| 0.8118055555555556 | 7.887 |
| 0.8125 | 7.887 |
| 0.8131944444444444 | 3.525 |
| 0.813888888888889 | 3.525 |
| 0.8145833333333333 | 3.525 |
| 0.8152777777777778 | 3.525 |
| 0.8159722222222222 | 3.525 |
| 0.8166666666666668 | 3.525 |
| 0.8173611111111111 | 3.525 |
| 0.8180555555555555 | 0 |
| 0.81875 | 0 |
| 0.8194444444444445 | 0 |
| 0.8201388888888889 | 0 |
| 0.8208333333333333 | 0 |
| 0.8215277777777777 | 0 |
| 0.8222222222222223 | 0 |
| 0.8229166666666666 | 0 |
| 0.8236111111111111 | 0 |
| 0.8243055555555556 | 0 |
| 0.8250000000000001 | 0 |
| 0.8256944444444444 | 0 |
| 0.8263888888888888 | 0 |
| 0.8270833333333334 | 0 |
| 0.8277777777777778 | 0 |
| 0.8284722222222222 | 0 |
| 0.8291666666666666 | 0 |
| 0.8298611111111112 | 0 |
| 0.8305555555555556 | 0 |
| 0.8312499999999999 | 0 |
| 0.8319444444444444 | 0 |
| 0.8326388888888889 | 0 |
| 0.8333333333333334 | 0 |
| 0.8340277777777777 | 0 |
| 0.8347222222222223 | 0 |
| 0.8354166666666667 | 0 |
| 0.8361111111111111 | 0 |
| 0.8368055555555555 | 0 |
| 0.8375 | 0 |
| 0.8381944444444445 | 0 |
| 0.8388888888888889 | 0 |
| 0.8395833333333332 | 0 |
| 0.8402777777777778 | 0 |
| 0.8409722222222222 | 0 |
| 0.8416666666666667 | 0 |
| 0.842361111111111 | 0 |
| 0.8430555555555556 | 0 |
| 0.84375 | 0 |
| 0.8444444444444444 | 0 |
| 0.845138888888889 | 0 |
| 0.8458333333333333 | 0 |
| 0.8465277777777778 | 0 |
| 0.8472222222222222 | 0 |
| 0.8479166666666668 | 0 |
| 0.8486111111111111 | 0 |
| 0.8493055555555555 | 0 |
| 0.85 | 0 |
| 0.8506944444444445 | 0 |
| 0.8513888888888889 | 0 |
| 0.8520833333333333 | 0 |
| 0.8527777777777777 | 0 |
| 0.8534722222222223 | 0 |
| 0.8541666666666666 | 0 |
| 0.8548611111111111 | 0 |
| 0.8555555555555556 | 0 |
| 0.8562500000000001 | 0 |
| 0.8569444444444444 | 0 |
| 0.8576388888888888 | 0 |
| 0.8583333333333334 | 0 |
| 0.8590277777777778 | 0 |
| 0.8597222222222222 | 0 |
| 0.8604166666666666 | 0 |
| 0.8611111111111112 | 0 |
| 0.8618055555555556 | 0 |
| 0.8624999999999999 | 0 |
| 0.8631944444444444 | 0 |
| 0.8638888888888889 | 0 |
| 0.8645833333333334 | 0 |
| 0.8652777777777777 | 0 |
| 0.8659722222222223 | 0 |
| 0.8666666666666667 | 0 |
| 0.8673611111111111 | 0 |
| 0.8680555555555555 | 0 |
| 0.86875 | 0 |
| 0.8694444444444445 | 0 |
| 0.8701388888888889 | 0 |
| 0.8708333333333332 | 0 |
| 0.8715277777777778 | 0 |
| 0.8722222222222222 | 0 |
| 0.8729166666666667 | 0 |
| 0.873611111111111 | 0 |
| 0.8743055555555556 | 0 |
| 0.875 | 0 |
| 0.8756944444444444 | 0 |
| 0.876388888888889 | 0 |
| 0.8770833333333333 | 0 |
| 0.8777777777777778 | 0 |
| 0.8784722222222222 | 0 |
| 0.8791666666666668 | 0 |
| 0.8798611111111111 | 0 |
| 0.8805555555555555 | 0 |
| 0.88125 | 0 |
| 0.8819444444444445 | 0 |
| 0.8826388888888889 | 0 |
| 0.8833333333333333 | 0 |
| 0.8840277777777777 | 0 |
| 0.8847222222222223 | 0 |
| 0.8854166666666666 | 0 |
| 0.8861111111111111 | 0 |
| 0.8868055555555556 | 0 |
| 0.8875000000000001 | 0 |
| 0.8881944444444444 | 0 |
| 0.8888888888888888 | 0 |
| 0.8895833333333334 | 0 |
| 0.8902777777777778 | 0 |
| 0.8909722222222222 | 0 |
| 0.8916666666666666 | 0 |
| 0.8923611111111112 | 0 |
| 0.8930555555555556 | 0 |
| 0.8937499999999999 | 0 |
| 0.8944444444444444 | 0 |
| 0.8951388888888889 | 0 |
| 0.8958333333333334 | 0 |
| 0.8965277777777777 | 0 |
| 0.8972222222222223 | 0 |
| 0.8979166666666667 | 0 |
| 0.8986111111111111 | 0 |
| 0.8993055555555555 | 0 |
| 0.9 | 0 |
| 0.9006944444444445 | 0 |
| 0.9013888888888889 | 0 |
| 0.9020833333333332 | 0 |
| 0.9027777777777778 | 0 |
| 0.9034722222222222 | 0 |
| 0.9041666666666667 | 0 |
| 0.904861111111111 | 0 |
| 0.9055555555555556 | 0 |
| 0.90625 | 0 |
| 0.9069444444444444 | 0 |
| 0.907638888888889 | 0 |
| 0.9083333333333333 | 0 |
| 0.9090277777777778 | 0 |
| 0.9097222222222222 | 0 |
| 0.9104166666666668 | 0 |
| 0.9111111111111111 | 0 |
| 0.9118055555555555 | 0 |
| 0.9125 | 0 |
| 0.9131944444444445 | 0 |
| 0.9138888888888889 | 0 |
| 0.9145833333333333 | 0 |
| 0.9152777777777777 | 0 |
| 0.9159722222222223 | 0 |
| 0.9166666666666666 | 0 |
| 0.9173611111111111 | 0 |
| 0.9180555555555556 | 0 |
| 0.9187500000000001 | 0 |
| 0.9194444444444444 | 0 |
| 0.9201388888888888 | 0 |
| 0.9208333333333334 | 0 |
| 0.9215277777777778 | 0 |
| 0.9222222222222222 | 0 |
| 0.9229166666666666 | 0 |
| 0.9236111111111112 | 0 |
| 0.9243055555555556 | 0 |
| 0.9249999999999999 | 0 |
| 0.9256944444444444 | 0 |
| 0.9263888888888889 | 0 |
| 0.9270833333333334 | 0 |
| 0.9277777777777777 | 0 |
| 0.9284722222222223 | 0 |
| 0.9291666666666667 | 0 |
| 0.9298611111111111 | 0 |
| 0.9305555555555555 | 0 |
| 0.93125 | 0 |
| 0.9319444444444445 | 0 |
| 0.9326388888888889 | 0 |
| 0.9333333333333332 | 0 |
| 0.9340277777777778 | 0 |
| 0.9347222222222222 | 0 |
| 0.9354166666666667 | 0 |
| 0.936111111111111 | 0 |
| 0.9368055555555556 | 0 |
| 0.9375 | 0 |
| 0.9381944444444444 | 0 |
| 0.938888888888889 | 0 |
| 0.9395833333333333 | 0 |
| 0.9402777777777778 | 0 |
| 0.9409722222222222 | 0 |
| 0.9416666666666668 | 0 |
| 0.9423611111111111 | 0 |
| 0.9430555555555555 | 0 |
| 0.94375 | 0 |
| 0.9444444444444445 | 0 |
| 0.9451388888888889 | 0 |
| 0.9458333333333333 | 0 |
| 0.9465277777777777 | 0 |
| 0.9472222222222223 | 0 |
| 0.9479166666666666 | 0 |
| 0.9486111111111111 | 0 |
| 0.9493055555555556 | 0 |
| 0.9500000000000001 | 0 |
| 0.9506944444444444 | 0 |
| 0.9513888888888888 | 0 |
| 0.9520833333333334 | 0 |
| 0.9527777777777778 | 0 |
| 0.9534722222222222 | 0 |
| 0.9541666666666666 | 0 |
| 0.9548611111111112 | 0 |
| 0.9555555555555556 | 0 |
| 0.9562499999999999 | 0 |
| 0.9569444444444444 | 0 |
| 0.9576388888888889 | 0 |
| 0.9583333333333334 | 0 |
| 0.9590277777777777 | 0 |
| 0.9597222222222223 | 0 |
| 0.9604166666666667 | 0 |
| 0.9611111111111111 | 0 |
| 0.9618055555555555 | 0 |
| 0.9625 | 0 |
| 0.9631944444444445 | 0 |
| 0.9638888888888889 | 0 |
| 0.9645833333333332 | 0 |
| 0.9652777777777778 | 0 |
| 0.9659722222222222 | 0 |
| 0.9666666666666667 | 0 |
| 0.967361111111111 | 0 |
| 0.9680555555555556 | 0 |
| 0.96875 | 0 |
| 0.9694444444444444 | 0 |
| 0.970138888888889 | 0 |
| 0.9708333333333333 | 0 |
| 0.9715277777777778 | 0 |
| 0.9722222222222222 | 0 |
| 0.9729166666666668 | 0 |
| 0.9736111111111111 | 0 |
| 0.9743055555555555 | 0 |
| 0.975 | 0 |
| 0.9756944444444445 | 0 |
| 0.9763888888888889 | 0 |
| 0.9770833333333333 | 0 |
| 0.9777777777777777 | 0 |
| 0.9784722222222223 | 0 |
| 0.9791666666666666 | 0 |
| 0.9798611111111111 | 0 |
| 0.9805555555555556 | 0 |
| 0.9812500000000001 | 0 |
| 0.9819444444444444 | 0 |
| 0.9826388888888888 | 0 |
| 0.9833333333333334 | 0 |
| 0.9840277777777778 | 0 |
| 0.9847222222222222 | 0 |
| 0.9854166666666666 | 0 |
| 0.9861111111111112 | 0 |
| 0.9868055555555556 | 0 |
| 0.9874999999999999 | 0 |
| 0.9881944444444444 | 0 |
| 0.9888888888888889 | 0 |
| 0.9895833333333334 | 0 |
| 0.9902777777777777 | 0 |
| 0.9909722222222223 | 0 |
| 0.9916666666666667 | 0 |
| 0.9923611111111111 | 0 |
| 0.9930555555555555 | 0 |
| 0.99375 | 0 |
| 0.9944444444444445 | 0 |
| 0.9951388888888889 | 0 |
| 0.9958333333333332 | 0 |
| 0.9965277777777778 | 0 |
| 0.9972222222222222 | 0 |
| 0.9979166666666667 | 0 |
| 0.998611111111111 | 0 |
| 0.9993055555555556 | 0 |